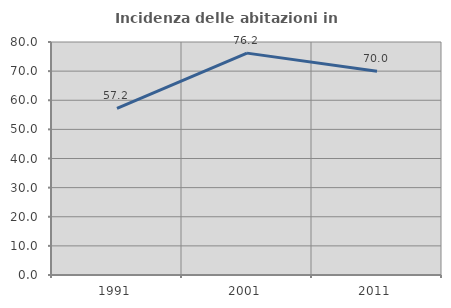
| Category | Incidenza delle abitazioni in proprietà  |
|---|---|
| 1991.0 | 57.173 |
| 2001.0 | 76.182 |
| 2011.0 | 69.984 |